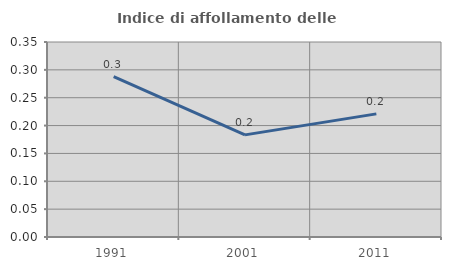
| Category | Indice di affollamento delle abitazioni  |
|---|---|
| 1991.0 | 0.288 |
| 2001.0 | 0.183 |
| 2011.0 | 0.221 |